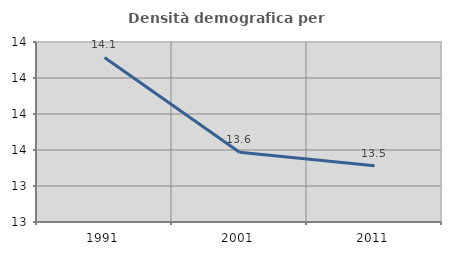
| Category | Densità demografica |
|---|---|
| 1991.0 | 14.114 |
| 2001.0 | 13.587 |
| 2011.0 | 13.512 |